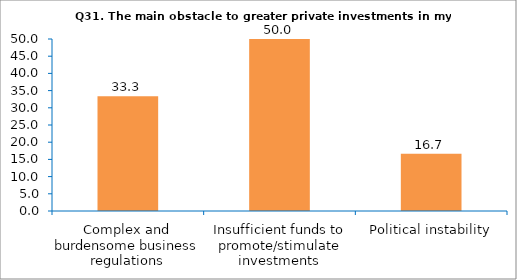
| Category | Series 0 |
|---|---|
| Complex and burdensome business regulations | 33.333 |
| Insufficient funds to promote/stimulate investments | 50 |
| Political instability | 16.667 |